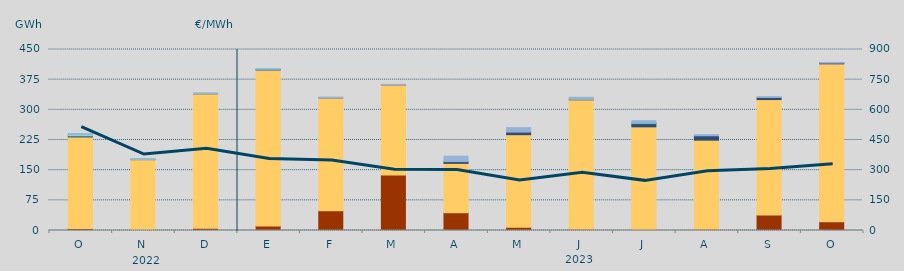
| Category | Carbón | Ciclo Combinado | Cogeneración | Consumo Bombeo | Enlace Península Baleares | Eólica | Hidráulica | Internacionales | Otras Renovables | Residuos no Renovables | Solar fotovoltaica | Solar térmica | Turbinación bombeo |
|---|---|---|---|---|---|---|---|---|---|---|---|---|---|
| O | 4836.8 | 227776.455 | 0 | 2792.6 | 0 | 0 | 208.75 | 3824.8 | 0 | 0 | 0 | 0 | 1365.5 |
| N | 2212.7 | 174006.854 | 0 | 126 | 0 | 0 | 449.2 | 613.333 | 0 | 0 | 0 | 0 | 1312.25 |
| D | 5478 | 334554.358 | 0 | 258.25 | 0 | 0 | 227.925 | 0 | 0 | 0 | 0 | 0 | 1594.663 |
| E | 11268 | 387716.675 | 0 | 572.573 | 681.8 | 0 | 835.85 | 0 | 0 | 0 | 0 | 0 | 77.5 |
| F | 48958 | 280733.853 | 0 | 43.033 | 0 | 0 | 0 | 0 | 0 | 0 | 0 | 0 | 1846.75 |
| M | 138130.4 | 224071.017 | 0 | 316.875 | 152.4 | 0 | 0 | 0 | 0 | 0 | 0 | 0 | 717.667 |
| A | 43920 | 122955.6 | 0 | 4435.017 | 148.1 | 0 | 0 | 0 | 0 | 0 | 0 | 0 | 13251.877 |
| M | 8172.8 | 230037.608 | 0 | 6374.2 | 1318.3 | 0 | 0 | 0 | 0 | 0 | 0 | 0 | 9849.292 |
| J | 3400 | 321495.908 | 0 | 191.083 | 1224 | 175.975 | 0 | 0 | 0 | 0 | 0 | 0 | 4721.775 |
| J | 2260 | 255417.442 | 0 | 8045.584 | 1144 | 41.666 | 475 | 647.8 | 0 | 0 | 0 | 0 | 5129.95 |
| A | 2834 | 221717.226 | 0 | 11049.55 | 362 | 0 | 144.325 | 0 | 0 | 0 | 0 | 0 | 2296.991 |
| S | 38425 | 287082.594 | 0 | 5227.584 | 0 | 0 | 0 | 0 | 0 | 0 | 0 | 0 | 2105.767 |
| O | 22001.7 | 391922.459 | 600 | 1995.167 | 550.783 | 0 | 0 | 0 | 108.25 | 0 | 0 | 0 | 659.78 |